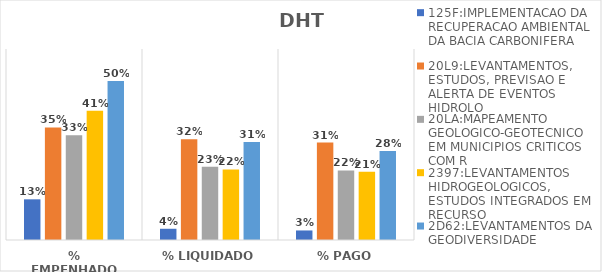
| Category | 125F:IMPLEMENTACAO DA RECUPERACAO AMBIENTAL DA BACIA CARBONIFERA | 20L9:LEVANTAMENTOS, ESTUDOS, PREVISAO E ALERTA DE EVENTOS HIDROLO | 20LA:MAPEAMENTO GEOLOGICO-GEOTECNICO EM MUNICIPIOS CRITICOS COM R | 2397:LEVANTAMENTOS HIDROGEOLOGICOS, ESTUDOS INTEGRADOS EM RECURSO | 2D62:LEVANTAMENTOS DA GEODIVERSIDADE |
|---|---|---|---|---|---|
| % EMPENHADO | 0.128 | 0.354 | 0.329 | 0.406 | 0.499 |
| % LIQUIDADO | 0.035 | 0.316 | 0.23 | 0.221 | 0.308 |
| % PAGO | 0.03 | 0.306 | 0.218 | 0.214 | 0.28 |